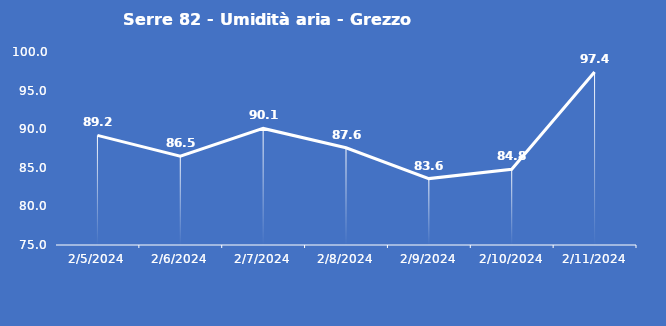
| Category | Serre 82 - Umidità aria - Grezzo (%) |
|---|---|
| 2/5/24 | 89.2 |
| 2/6/24 | 86.5 |
| 2/7/24 | 90.1 |
| 2/8/24 | 87.6 |
| 2/9/24 | 83.6 |
| 2/10/24 | 84.8 |
| 2/11/24 | 97.4 |